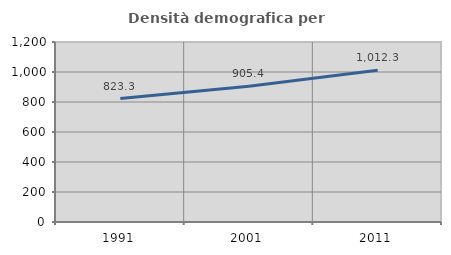
| Category | Densità demografica |
|---|---|
| 1991.0 | 823.295 |
| 2001.0 | 905.408 |
| 2011.0 | 1012.263 |